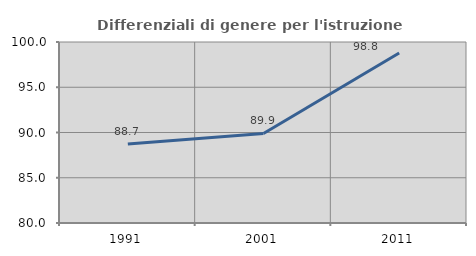
| Category | Differenziali di genere per l'istruzione superiore |
|---|---|
| 1991.0 | 88.722 |
| 2001.0 | 89.893 |
| 2011.0 | 98.776 |